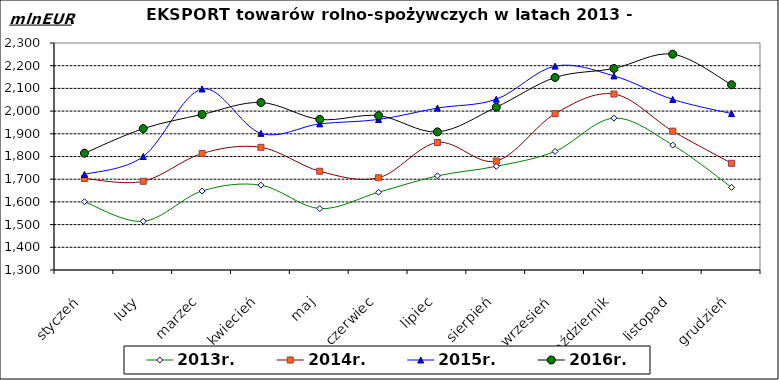
| Category | 2013r. | 2014r. | 2015r. | 2016r. |
|---|---|---|---|---|
| styczeń | 1600.614 | 1702.854 | 1720.778 | 1814.501 |
| luty | 1514.415 | 1690.882 | 1800.122 | 1922.821 |
| marzec | 1647.907 | 1813.347 | 2097.478 | 1985.262 |
| kwiecień | 1673.739 | 1840.53 | 1901.974 | 2038.006 |
| maj | 1570.58 | 1735.138 | 1943.726 | 1963.46 |
| czerwiec | 1642.565 | 1706.325 | 1963.112 | 1980.104 |
| lipiec | 1714.716 | 1861.665 | 2013.306 | 1908.422 |
| sierpień | 1756.717 | 1780.06 | 2052.377 | 2017.096 |
| wrzesień | 1822.658 | 1988.672 | 2198.234 | 2147.944 |
| październik | 1968.921 | 2075.167 | 2155.013 | 2187.942 |
| listopad | 1850.234 | 1911.792 | 2051.463 | 2250.718 |
| grudzień | 1664.117 | 1770.054 | 1988.951 | 2116.17 |